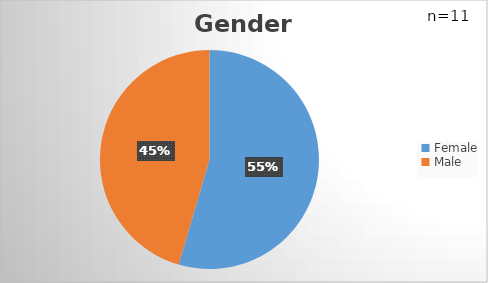
| Category | Series 0 |
|---|---|
| Female | 6 |
| Male | 5 |